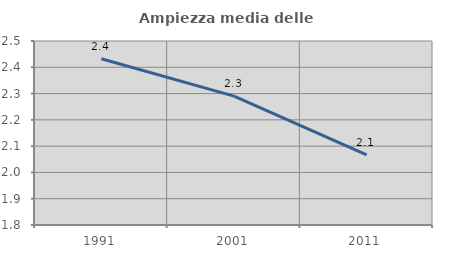
| Category | Ampiezza media delle famiglie |
|---|---|
| 1991.0 | 2.433 |
| 2001.0 | 2.29 |
| 2011.0 | 2.066 |